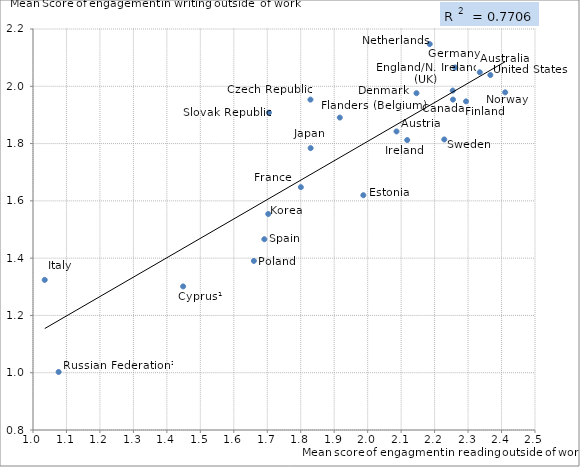
| Category | Series 1 |
|---|---|
| 2.334999768616913 | 2.049 |
| 2.086159823737894 | 1.842 |
| 2.2549539377571253 | 1.954 |
| 1.448602093900424 | 1.301 |
| 1.8290226793229745 | 1.953 |
| 2.1458730241423365 | 1.976 |
| 2.2541477722971615 | 1.985 |
| 1.9870207636059605 | 1.62 |
| 2.2939377636935876 | 1.947 |
| 1.9166919051300721 | 1.891 |
| 1.800324030407017 | 1.648 |
| 2.2616363662456065 | 2.065 |
| 2.118141909319378 | 1.812 |
| 1.0350295692125813 | 1.324 |
| 1.8296259885937434 | 1.784 |
| 1.7029602007531934 | 1.554 |
| 2.185436157183366 | 2.147 |
| 2.4108449066618145 | 1.979 |
| 1.6600149224627787 | 1.39 |
| 1.0765986772696856 | 1.003 |
| 1.7050357572394406 | 1.908 |
| 1.6912206536198848 | 1.466 |
| 2.2288906139148317 | 1.814 |
| 2.3665927914267986 | 2.039 |